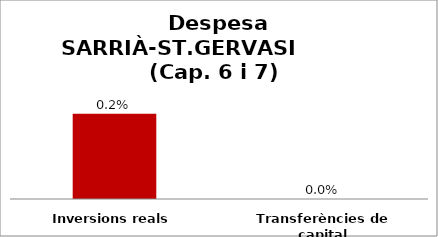
| Category | Series 0 |
|---|---|
| Inversions reals | 0.002 |
| Transferències de capital | 0 |